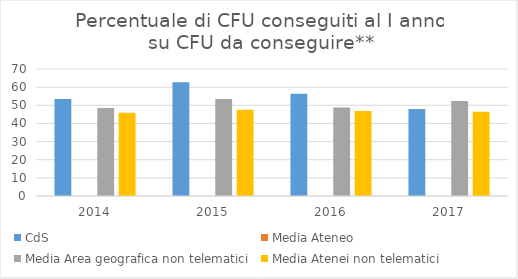
| Category | CdS | Media Ateneo | Media Area geografica non telematici | Media Atenei non telematici |
|---|---|---|---|---|
| 2014.0 | 53.5 |  | 48.5 | 45.9 |
| 2015.0 | 62.7 |  | 53.4 | 47.6 |
| 2016.0 | 56.3 |  | 48.8 | 46.8 |
| 2017.0 | 48 |  | 52.3 | 46.4 |